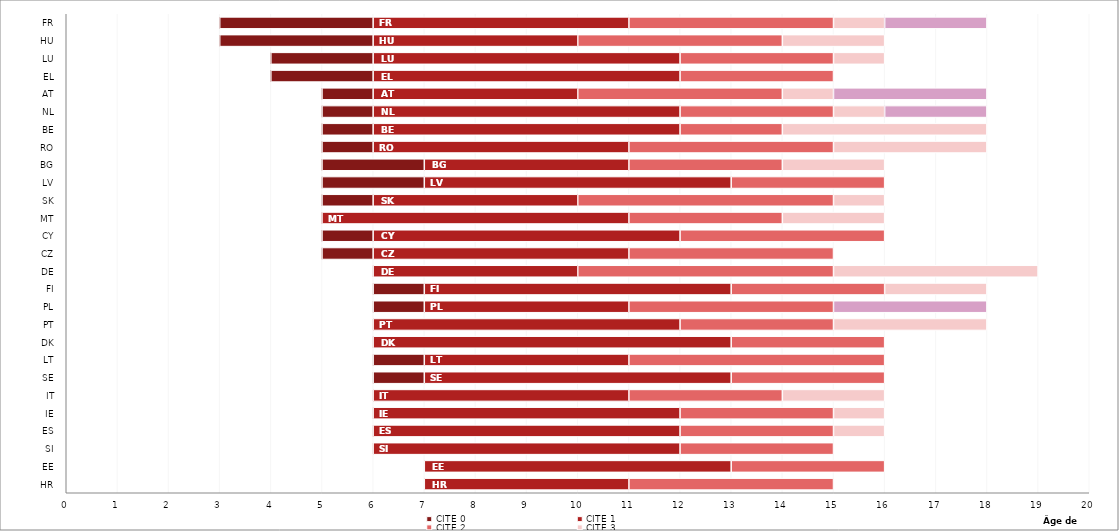
| Category | Âge obligatoire d'entrée dans le sco | CITE 0 | CITE 1 | CITE 2 | CITE 3 | Obligation de formation |
|---|---|---|---|---|---|---|
| HR | 7 | 0 | 4 | 4 | 0 | 0 |
| EE | 7 | 0 | 6 | 3 | 0 | 0 |
| SI | 6 | 0 | 6 | 3 | 0 | 0 |
| ES | 6 | 0 | 6 | 3 | 1 | 0 |
| IE | 6 | 0 | 6 | 3 | 1 | 0 |
| IT | 6 | 0 | 5 | 3 | 2 | 0 |
| SE | 6 | 1 | 6 | 3 | 0 | 0 |
| LT | 6 | 1 | 4 | 5 | 0 | 0 |
| DK | 6 | 0 | 7 | 3 | 0 | 0 |
| PT | 6 | 0 | 6 | 3 | 3 | 0 |
| PL | 6 | 1 | 4 | 4 | 0 | 3 |
| FI | 6 | 1 | 6 | 3 | 2 | 0 |
| DE | 6 | 0 | 4 | 5 | 4 | 0 |
| CZ | 5 | 1 | 5 | 4 | 0 | 0 |
| CY | 5 | 1 | 6 | 4 | 0 | 0 |
| MT | 5 | 0 | 6 | 3 | 2 | 0 |
| SK | 5 | 1 | 4 | 5 | 1 | 0 |
| LV | 5 | 2 | 6 | 3 | 0 | 0 |
| BG | 5 | 2 | 4 | 3 | 2 | 0 |
| RO | 5 | 1 | 5 | 4 | 3 | 0 |
| BE | 5 | 1 | 6 | 2 | 4 | 0 |
| NL | 5 | 1 | 6 | 3 | 1 | 2 |
| AT | 5 | 1 | 4 | 4 | 1 | 3 |
| EL | 4 | 2 | 6 | 3 | 0 | 0 |
| LU | 4 | 2 | 6 | 3 | 1 | 0 |
| HU | 3 | 3 | 4 | 4 | 2 | 0 |
| FR | 3 | 3 | 5 | 4 | 1 | 2 |